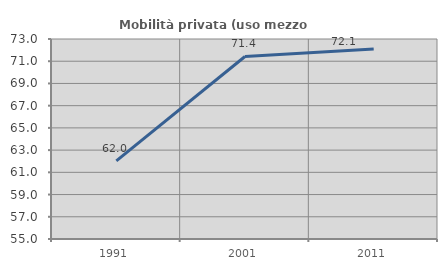
| Category | Mobilità privata (uso mezzo privato) |
|---|---|
| 1991.0 | 62.032 |
| 2001.0 | 71.429 |
| 2011.0 | 72.101 |